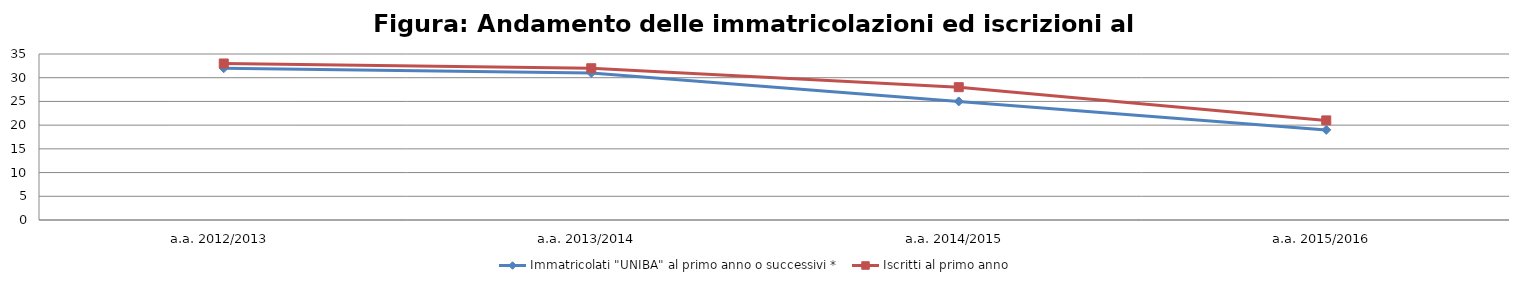
| Category | Immatricolati "UNIBA" al primo anno o successivi * | Iscritti al primo anno  |
|---|---|---|
| a.a. 2012/2013 | 32 | 33 |
| a.a. 2013/2014 | 31 | 32 |
| a.a. 2014/2015 | 25 | 28 |
| a.a. 2015/2016 | 19 | 21 |